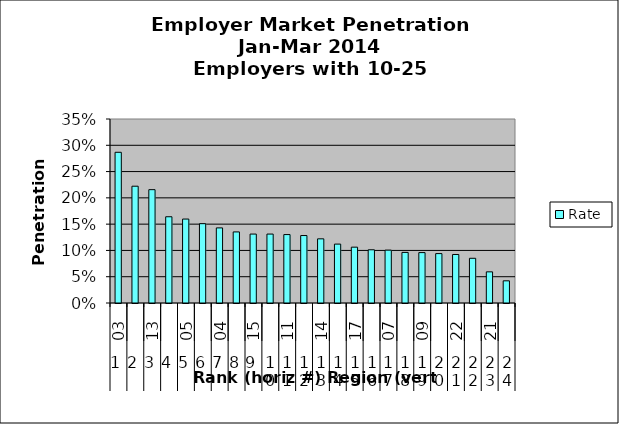
| Category | Rate |
|---|---|
| 0 | 0.287 |
| 1 | 0.222 |
| 2 | 0.216 |
| 3 | 0.164 |
| 4 | 0.16 |
| 5 | 0.151 |
| 6 | 0.143 |
| 7 | 0.135 |
| 8 | 0.131 |
| 9 | 0.131 |
| 10 | 0.13 |
| 11 | 0.128 |
| 12 | 0.122 |
| 13 | 0.112 |
| 14 | 0.106 |
| 15 | 0.101 |
| 16 | 0.101 |
| 17 | 0.096 |
| 18 | 0.096 |
| 19 | 0.094 |
| 20 | 0.092 |
| 21 | 0.085 |
| 22 | 0.059 |
| 23 | 0.042 |